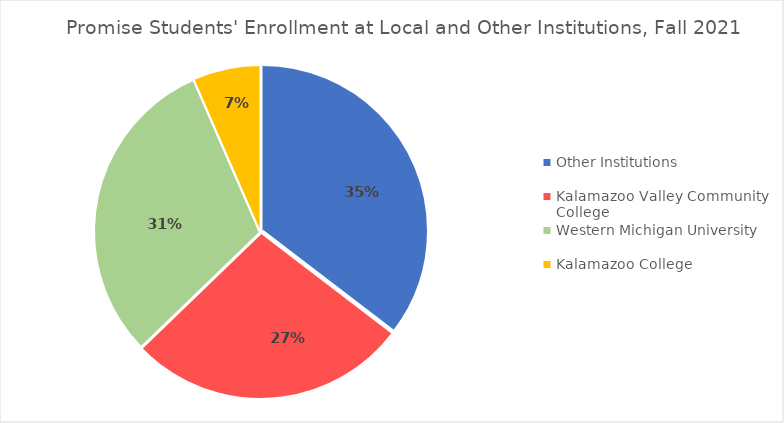
| Category | Series 1 |
|---|---|
| Other Institutions | 0.354 |
| Kalamazoo Valley Community College | 0.274 |
| Western Michigan University | 0.307 |
| Kalamazoo College | 0.065 |